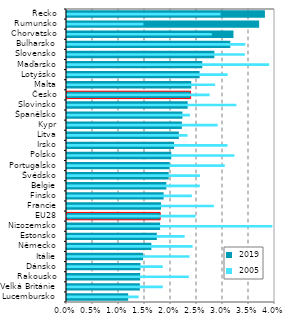
| Category |  2019 |
|---|---|
| Lucembursko | 0.012 |
| Velká Británie | 0.014 |
| Rakousko | 0.014 |
| Dánsko | 0.014 |
| Itálie | 0.015 |
| Německo | 0.016 |
| Estonsko | 0.017 |
| Nizozemsko | 0.018 |
| EU28 | 0.018 |
| Francie | 0.018 |
| Finsko | 0.019 |
| Belgie | 0.019 |
| Švédsko | 0.02 |
| Portugalsko | 0.02 |
| Polsko | 0.02 |
| Irsko | 0.021 |
| Litva | 0.022 |
| Kypr | 0.022 |
| Španělsko | 0.022 |
| Slovinsko | 0.023 |
| Česko | 0.024 |
| Malta | 0.024 |
| Lotyšsko | 0.026 |
| Maďarsko | 0.026 |
| Slovensko | 0.029 |
| Bulharsko | 0.032 |
| Chorvatsko | 0.032 |
| Rumunsko | 0.037 |
| Řecko | 0.038 |